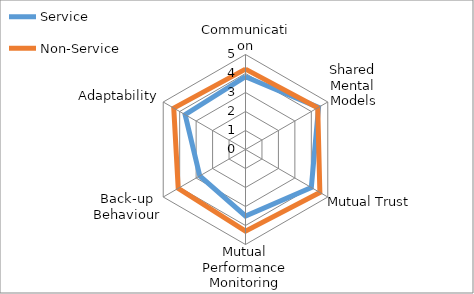
| Category | Service | Non-Service |
|---|---|---|
| Communication | 3.83 | 4.23 |
| Shared Mental Models | 4.44 | 4.39 |
| Mutual Trust | 4 | 4.52 |
| Mutual Performance Monitoring | 3.5 | 4.3 |
| Back-up Behaviour | 2.78 | 4.09 |
| Adaptability | 3.67 | 4.36 |